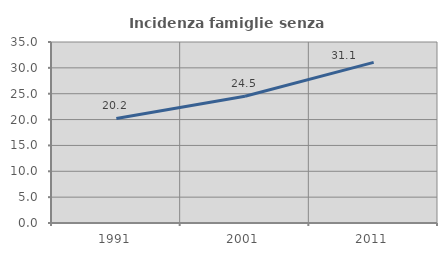
| Category | Incidenza famiglie senza nuclei |
|---|---|
| 1991.0 | 20.21 |
| 2001.0 | 24.498 |
| 2011.0 | 31.059 |